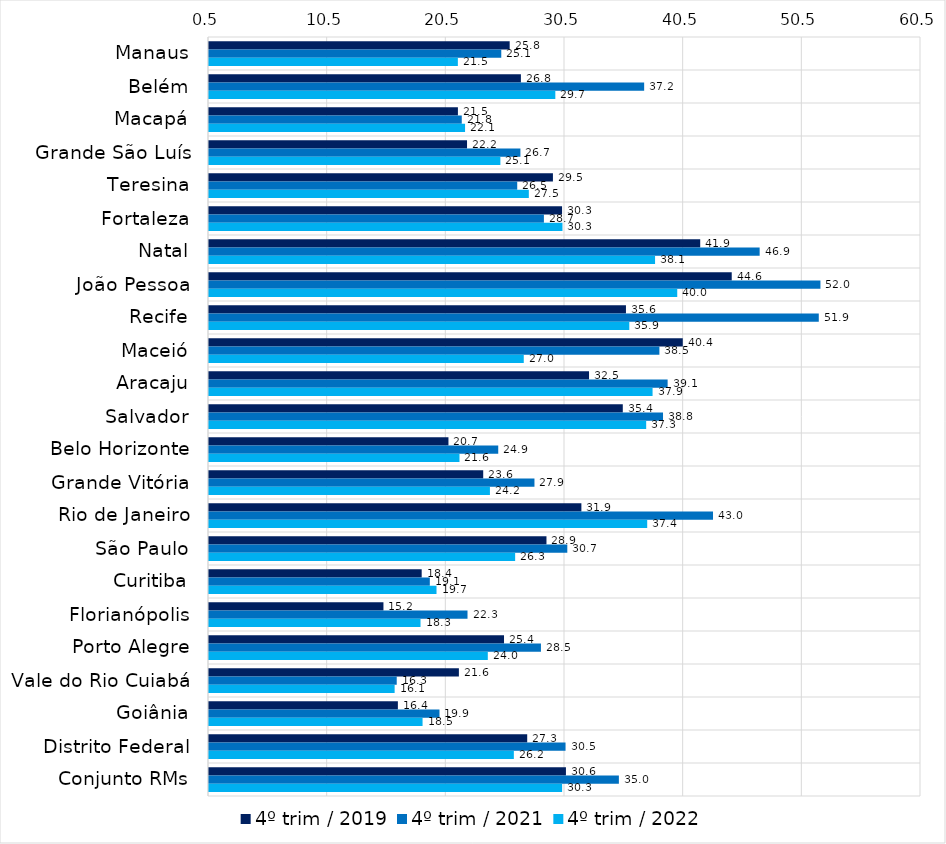
| Category | 4º trim / 2019 | 4º trim / 2021 | 4º trim / 2022 |
|---|---|---|---|
| Manaus | 25.838 | 25.13 | 21.471 |
| Belém | 26.784 | 37.171 | 29.685 |
| Macapá | 21.476 | 21.8 | 22.079 |
| Grande São Luís | 22.244 | 26.743 | 25.055 |
| Teresina | 29.483 | 26.474 | 27.452 |
| Fortaleza | 30.252 | 28.722 | 30.285 |
| Natal | 41.895 | 46.903 | 38.09 |
| João Pessoa | 44.55 | 52.026 | 39.959 |
| Recife | 35.637 | 51.886 | 35.918 |
| Maceió | 40.425 | 38.455 | 27.025 |
| Aracaju | 32.526 | 39.149 | 37.879 |
| Salvador | 35.37 | 38.76 | 37.341 |
| Belo Horizonte | 20.679 | 24.874 | 21.608 |
| Grande Vitória | 23.608 | 27.926 | 24.173 |
| Rio de Janeiro | 31.881 | 42.973 | 37.427 |
| São Paulo | 28.938 | 30.694 | 26.299 |
| Curitiba | 18.423 | 19.108 | 19.672 |
| Florianópolis | 15.2 | 22.285 | 18.325 |
| Porto Alegre | 25.361 | 28.472 | 23.994 |
| Vale do Rio Cuiabá | 21.558 | 16.32 | 16.144 |
| Goiânia | 16.417 | 19.923 | 18.497 |
| Distrito Federal | 27.315 | 30.546 | 26.189 |
| Conjunto RMs | 30.579 | 35.04 | 30.256 |